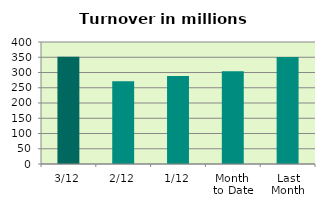
| Category | Series 0 |
|---|---|
| 3/12 | 351.557 |
| 2/12 | 271.244 |
| 1/12 | 288.602 |
| Month 
to Date | 303.801 |
| Last
Month | 350.651 |